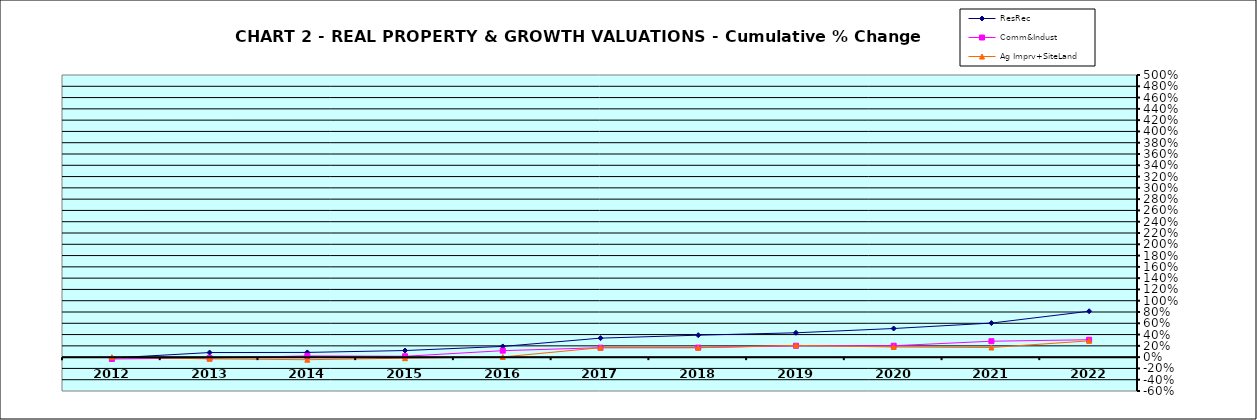
| Category | ResRec | Comm&Indust | Ag Imprv+SiteLand |
|---|---|---|---|
| 2012.0 | -0.015 | -0.033 | 0 |
| 2013.0 | 0.081 | -0.015 | -0.03 |
| 2014.0 | 0.084 | 0.021 | -0.046 |
| 2015.0 | 0.117 | 0.016 | -0.018 |
| 2016.0 | 0.19 | 0.115 | 0.003 |
| 2017.0 | 0.337 | 0.168 | 0.168 |
| 2018.0 | 0.389 | 0.169 | 0.167 |
| 2019.0 | 0.432 | 0.202 | 0.209 |
| 2020.0 | 0.507 | 0.202 | 0.179 |
| 2021.0 | 0.603 | 0.282 | 0.171 |
| 2022.0 | 0.813 | 0.308 | 0.289 |